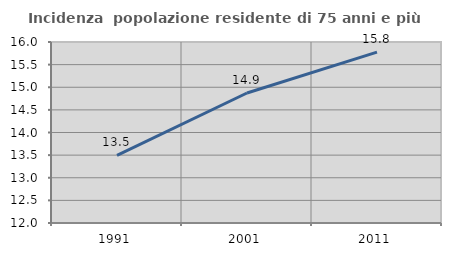
| Category | Incidenza  popolazione residente di 75 anni e più |
|---|---|
| 1991.0 | 13.496 |
| 2001.0 | 14.873 |
| 2011.0 | 15.778 |